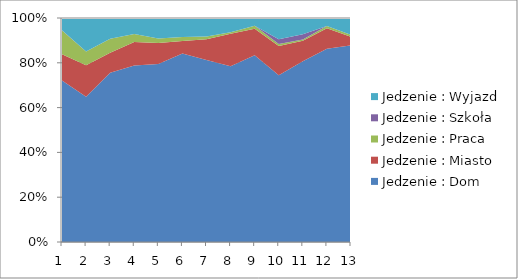
| Category | Jedzenie : Dom | Jedzenie : Miasto | Jedzenie : Praca | Jedzenie : Szkoła | Jedzenie : Wyjazd |
|---|---|---|---|---|---|
| 0 | 1156.023 | 189.248 | 169.053 | 2.092 | 87.758 |
| 1 | 954.478 | 206.846 | 91.178 | 0 | 219.993 |
| 2 | 1020.368 | 119.419 | 84.672 | 0 | 125.187 |
| 3 | 1209.226 | 161.301 | 53.958 | 0 | 109.632 |
| 4 | 1561.826 | 183.958 | 38.105 | 0 | 180.573 |
| 5 | 1581.515 | 104.947 | 33.562 | 0 | 158.398 |
| 6 | 1649.535 | 189.758 | 23.771 | 0 | 168.123 |
| 7 | 1857.901 | 344.587 | 15.497 | 0 | 150.138 |
| 8 | 1790.128 | 254.821 | 27.907 | 0 | 75.257 |
| 9 | 1743.216 | 305.634 | 21.546 | 49.985 | 221.249 |
| 10 | 1834.54 | 207.57 | 12.757 | 54.6 | 163.888 |
| 11 | 1925.917 | 204.904 | 23.067 | 0 | 78.71 |
| 12 | 1793.536 | 77.49 | 18.807 | 0 | 152.94 |